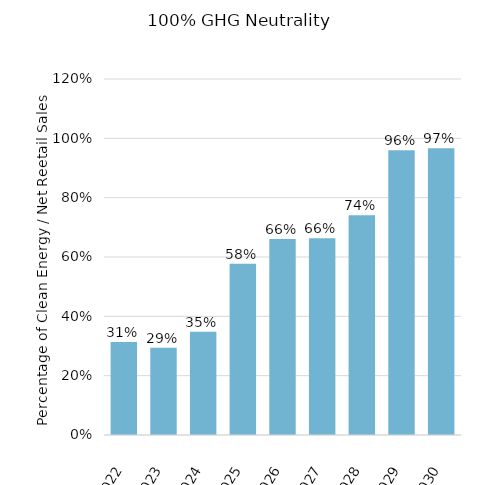
| Category | Percentage Clean Energy |
|---|---|
| 2022.0 | 0.313 |
| 2023.0 | 0.294 |
| 2024.0 | 0.348 |
| 2025.0 | 0.577 |
| 2026.0 | 0.661 |
| 2027.0 | 0.663 |
| 2028.0 | 0.741 |
| 2029.0 | 0.96 |
| 2030.0 | 0.967 |